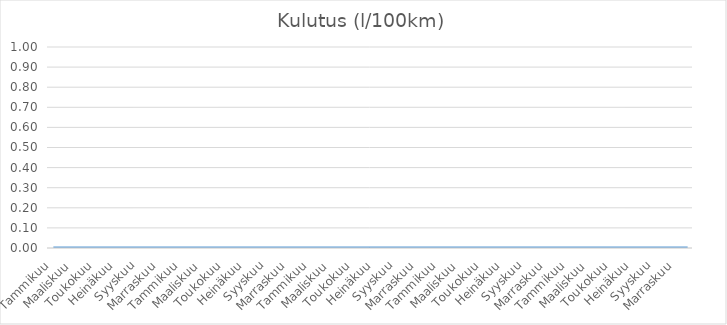
| Category | Series 0 |
|---|---|
| Tammikuu | 0 |
| Helmikuu | 0 |
| Maaliskuu | 0 |
| Huhtikuu | 0 |
| Toukokuu | 0 |
| Kesäkuu | 0 |
| Heinäkuu | 0 |
| Elokuu | 0 |
| Syyskuu | 0 |
| Lokakuu | 0 |
| Marraskuu | 0 |
| Joulukuu | 0 |
| Tammikuu | 0 |
| Helmikuu | 0 |
| Maaliskuu | 0 |
| Huhtikuu | 0 |
| Toukokuu | 0 |
| Kesäkuu | 0 |
| Heinäkuu | 0 |
| Elokuu | 0 |
| Syyskuu | 0 |
| Lokakuu | 0 |
| Marraskuu | 0 |
| Joulukuu | 0 |
| Tammikuu | 0 |
| Helmikuu | 0 |
| Maaliskuu | 0 |
| Huhtikuu | 0 |
| Toukokuu | 0 |
| Kesäkuu | 0 |
| Heinäkuu | 0 |
| Elokuu | 0 |
| Syyskuu | 0 |
| Lokakuu | 0 |
| Marraskuu | 0 |
| Joulukuu | 0 |
| Tammikuu | 0 |
| Helmikuu | 0 |
| Maaliskuu | 0 |
| Huhtikuu | 0 |
| Toukokuu | 0 |
| Kesäkuu | 0 |
| Heinäkuu | 0 |
| Elokuu | 0 |
| Syyskuu | 0 |
| Lokakuu | 0 |
| Marraskuu | 0 |
| Joulukuu | 0 |
| Tammikuu | 0 |
| Helmikuu | 0 |
| Maaliskuu | 0 |
| Huhtikuu | 0 |
| Toukokuu | 0 |
| Kesäkuu | 0 |
| Heinäkuu | 0 |
| Elokuu | 0 |
| Syyskuu | 0 |
| Lokakuu | 0 |
| Marraskuu | 0 |
| Joulukuu | 0 |